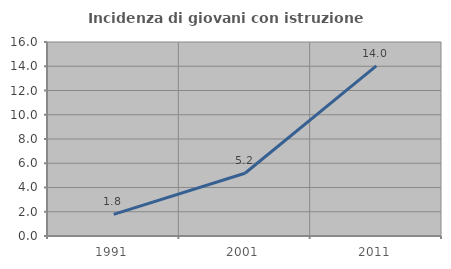
| Category | Incidenza di giovani con istruzione universitaria |
|---|---|
| 1991.0 | 1.786 |
| 2001.0 | 5.172 |
| 2011.0 | 14.035 |